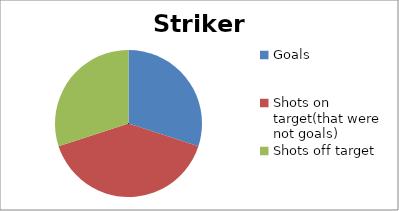
| Category | Striker 3 |
|---|---|
| Goals | 15 |
| Shots on target(that were not goals) | 20 |
| Shots off target | 15 |